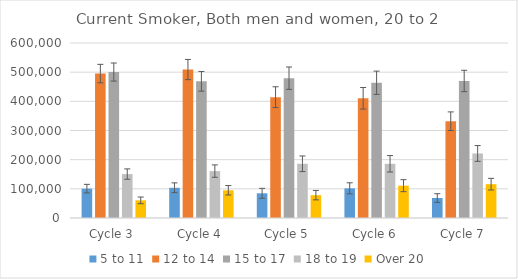
| Category | 5 to 11 | 12 to 14 | 15 to 17 | 18 to 19 | Over 20 |
|---|---|---|---|---|---|
| Cycle 3 | 100689 | 495113 | 500379 | 150591 | 60500 |
| Cycle 4 | 103660 | 509012 | 468672 | 160790 | 95050 |
| Cycle 5 | 84701 | 414327 | 479318 | 185926 | 78316 |
| Cycle 6 | 101741 | 410418 | 463732 | 185830 | 110842 |
| Cycle 7 | 68501 | 331889 | 469789 | 221311 | 115968 |